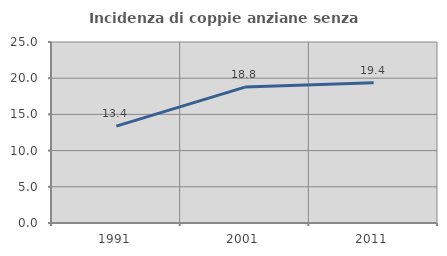
| Category | Incidenza di coppie anziane senza figli  |
|---|---|
| 1991.0 | 13.376 |
| 2001.0 | 18.771 |
| 2011.0 | 19.357 |